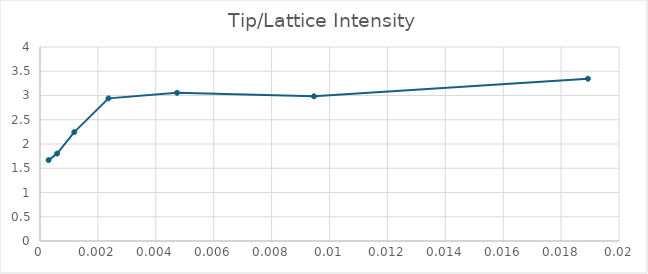
| Category | Tip/Lattice Intensity |
|---|---|
| 0.00029572 | 1.668 |
| 0.00059144 | 1.802 |
| 0.00118288 | 2.246 |
| 0.00236576 | 2.941 |
| 0.00473152 | 3.054 |
| 0.00946304 | 2.983 |
| 0.01892608 | 3.346 |